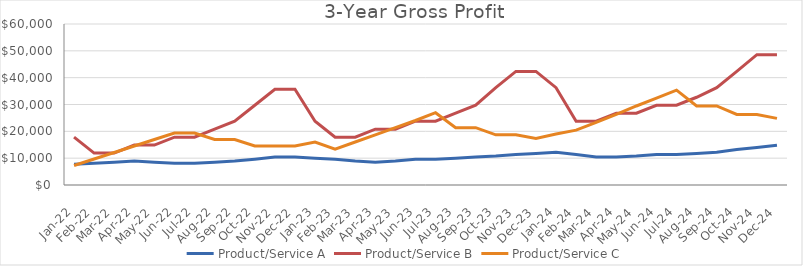
| Category | Product/Service A | Product/Service B | Product/Service C |
|---|---|---|---|
| 2022-01-16 | 7745 | 17835 | 7266 |
| 2022-02-16 | 8132.25 | 11890 | 9688 |
| 2022-03-16 | 8519.5 | 11890 | 12110 |
| 2022-04-16 | 8906.75 | 14862.5 | 14532 |
| 2022-05-16 | 8519.5 | 14862.5 | 16954 |
| 2022-06-16 | 8132.25 | 17835 | 19376 |
| 2022-07-16 | 8132.25 | 17835 | 19376 |
| 2022-08-16 | 8519.5 | 20807.5 | 16954 |
| 2022-09-16 | 8906.75 | 23780 | 16954 |
| 2022-10-16 | 9594 | 29725 | 14532 |
| 2022-11-16 | 10393.5 | 35670 | 14532 |
| 2022-12-16 | 10393.5 | 35670 | 14532 |
| 2023-01-16 | 9993.75 | 23780 | 16032 |
| 2023-02-16 | 9594 | 17835 | 13360 |
| 2023-03-16 | 8906.75 | 17835 | 16032 |
| 2023-04-16 | 8519.5 | 20807.5 | 18704 |
| 2023-05-16 | 8906.75 | 20807.5 | 21376 |
| 2023-06-16 | 9594 | 23780 | 24048 |
| 2023-07-16 | 9594 | 23780 | 26945 |
| 2023-08-16 | 9993.75 | 26752.5 | 21376 |
| 2023-09-16 | 10393.5 | 29725 | 21376 |
| 2023-10-16 | 10793.25 | 36270 | 18704 |
| 2023-11-16 | 11368 | 42315 | 18704 |
| 2023-12-16 | 11774 | 42315 | 17368 |
| 2024-01-16 | 12180 | 36270 | 18993 |
| 2024-02-16 | 11368 | 23780 | 20454 |
| 2024-03-16 | 10393.5 | 23780 | 23376 |
| 2024-04-16 | 10393.5 | 26752.5 | 26298 |
| 2024-05-16 | 10793.25 | 26752.5 | 29445 |
| 2024-06-16 | 11368 | 29725 | 32389.5 |
| 2024-07-16 | 11368 | 29725 | 35334 |
| 2024-08-16 | 11774 | 32697.5 | 29445 |
| 2024-09-16 | 12180 | 36270 | 29445 |
| 2024-10-16 | 13192 | 42315 | 26298 |
| 2024-11-16 | 14016.5 | 48560 | 26298 |
| 2024-12-16 | 14841 | 48560 | 24837 |